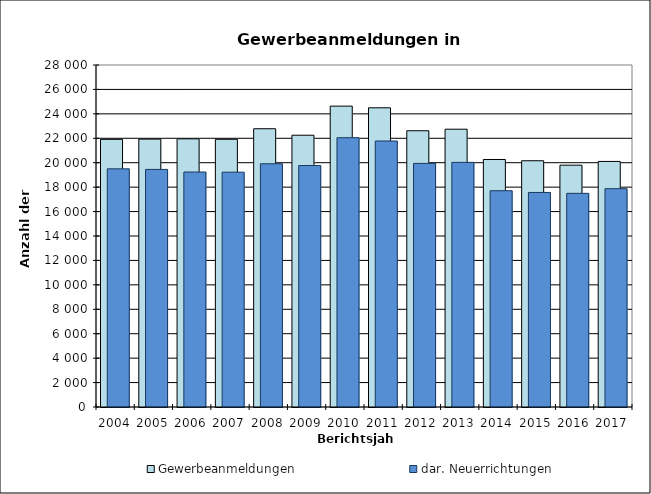
| Category | Gewerbeanmeldungen | dar. Neuerrichtungen |
|---|---|---|
| 2004.0 | 21914 | 19499 |
| 2005.0 | 21931 | 19452 |
| 2006.0 | 21955 | 19238 |
| 2007.0 | 21918 | 19225 |
| 2008.0 | 22781 | 19914 |
| 2009.0 | 22250 | 19769 |
| 2010.0 | 24632 | 22046 |
| 2011.0 | 24495 | 21777 |
| 2012.0 | 22618 | 19945 |
| 2013.0 | 22743 | 20029 |
| 2014.0 | 20264 | 17706 |
| 2015.0 | 20162 | 17566 |
| 2016.0 | 19798 | 17492 |
| 2017.0 | 20105 | 17874 |